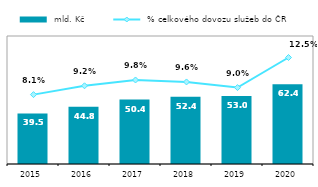
| Category |  mld. Kč |
|---|---|
| 2015.0 | 39.517 |
| 2016.0 | 44.807 |
| 2017.0 | 50.389 |
| 2018.0 | 52.446 |
| 2019.0 | 53.04 |
| 2020.0 | 62.374 |